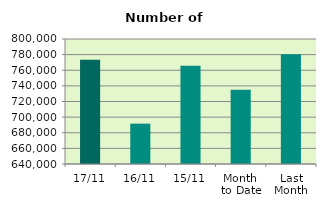
| Category | Series 0 |
|---|---|
| 17/11 | 773460 |
| 16/11 | 691646 |
| 15/11 | 765616 |
| Month 
to Date | 734973.077 |
| Last
Month | 780428.952 |